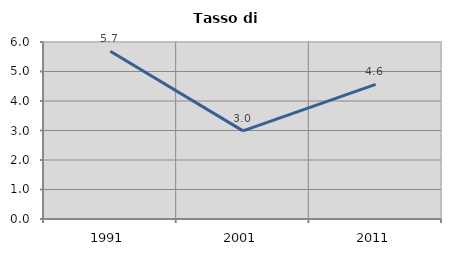
| Category | Tasso di disoccupazione   |
|---|---|
| 1991.0 | 5.687 |
| 2001.0 | 2.986 |
| 2011.0 | 4.562 |